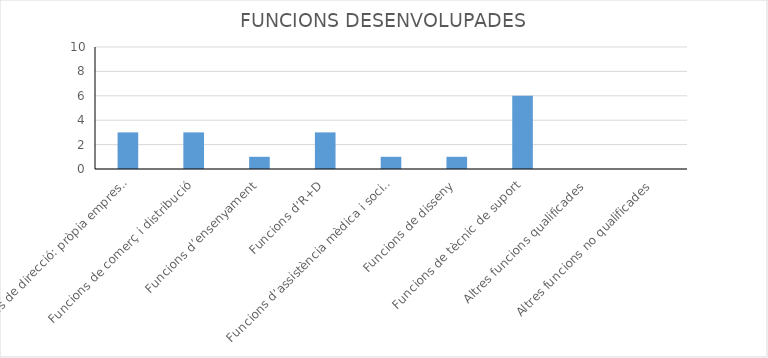
| Category | Series 0 |
|---|---|
| Funcions de direcció: pròpia empresa, direcció, producció, financera, etc. | 3 |
| Funcions de comerç i distribució | 3 |
| Funcions d’ensenyament | 1 |
| Funcions d’R+D | 3 |
| Funcions d’assistència mèdica i social | 1 |
| Funcions de disseny | 1 |
| Funcions de tècnic de suport | 6 |
| Altres funcions qualificades | 0 |
| Altres funcions no qualificades | 0 |